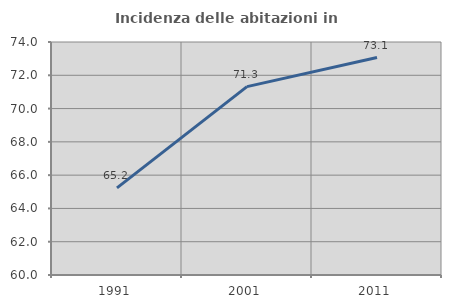
| Category | Incidenza delle abitazioni in proprietà  |
|---|---|
| 1991.0 | 65.234 |
| 2001.0 | 71.317 |
| 2011.0 | 73.067 |